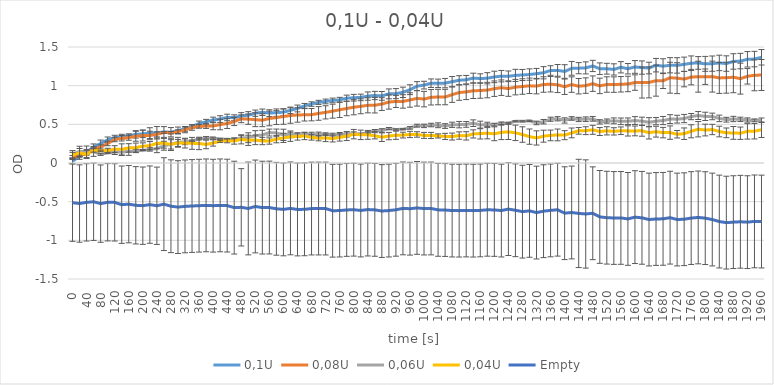
| Category | 0,1U | 0,08U | 0,06U | 0,04U | Empty |
|---|---|---|---|---|---|
| 0.0 | 0.023 | 0.071 | 0.111 | 0.102 | -0.513 |
| 20.0 | 0.086 | 0.095 | 0.151 | 0.131 | -0.524 |
| 40.0 | 0.138 | 0.133 | 0.145 | 0.111 | -0.509 |
| 60.0 | 0.208 | 0.178 | 0.147 | 0.163 | -0.501 |
| 80.0 | 0.252 | 0.208 | 0.112 | 0.159 | -0.525 |
| 100.0 | 0.3 | 0.253 | 0.132 | 0.162 | -0.508 |
| 120.0 | 0.328 | 0.304 | 0.142 | 0.18 | -0.509 |
| 140.0 | 0.34 | 0.32 | 0.14 | 0.176 | -0.539 |
| 160.0 | 0.353 | 0.327 | 0.15 | 0.195 | -0.532 |
| 180.0 | 0.37 | 0.346 | 0.156 | 0.199 | -0.547 |
| 200.0 | 0.377 | 0.355 | 0.163 | 0.217 | -0.552 |
| 220.0 | 0.386 | 0.356 | 0.176 | 0.225 | -0.538 |
| 240.0 | 0.391 | 0.37 | 0.187 | 0.254 | -0.553 |
| 260.0 | 0.401 | 0.395 | 0.223 | 0.255 | -0.532 |
| 280.0 | 0.398 | 0.391 | 0.241 | 0.241 | -0.559 |
| 300.0 | 0.42 | 0.405 | 0.268 | 0.259 | -0.57 |
| 320.0 | 0.441 | 0.428 | 0.274 | 0.257 | -0.561 |
| 340.0 | 0.472 | 0.458 | 0.287 | 0.254 | -0.556 |
| 360.0 | 0.509 | 0.474 | 0.31 | 0.253 | -0.552 |
| 380.0 | 0.532 | 0.478 | 0.325 | 0.24 | -0.548 |
| 400.0 | 0.557 | 0.479 | 0.322 | 0.259 | -0.552 |
| 420.0 | 0.568 | 0.497 | 0.31 | 0.28 | -0.548 |
| 440.0 | 0.589 | 0.51 | 0.307 | 0.287 | -0.551 |
| 460.0 | 0.587 | 0.536 | 0.302 | 0.285 | -0.577 |
| 480.0 | 0.606 | 0.572 | 0.323 | 0.306 | -0.573 |
| 500.0 | 0.617 | 0.567 | 0.327 | 0.293 | -0.588 |
| 520.0 | 0.644 | 0.56 | 0.352 | 0.299 | -0.562 |
| 540.0 | 0.656 | 0.553 | 0.362 | 0.284 | -0.577 |
| 560.0 | 0.645 | 0.576 | 0.394 | 0.284 | -0.576 |
| 580.0 | 0.651 | 0.587 | 0.389 | 0.308 | -0.592 |
| 600.0 | 0.657 | 0.601 | 0.364 | 0.325 | -0.6 |
| 620.0 | 0.681 | 0.614 | 0.371 | 0.339 | -0.587 |
| 640.0 | 0.705 | 0.621 | 0.36 | 0.343 | -0.601 |
| 660.0 | 0.739 | 0.623 | 0.368 | 0.35 | -0.599 |
| 680.0 | 0.762 | 0.625 | 0.371 | 0.331 | -0.589 |
| 700.0 | 0.784 | 0.641 | 0.374 | 0.32 | -0.589 |
| 720.0 | 0.796 | 0.655 | 0.372 | 0.324 | -0.589 |
| 740.0 | 0.809 | 0.67 | 0.36 | 0.316 | -0.617 |
| 760.0 | 0.817 | 0.688 | 0.366 | 0.33 | -0.615 |
| 780.0 | 0.838 | 0.705 | 0.368 | 0.348 | -0.607 |
| 800.0 | 0.844 | 0.721 | 0.379 | 0.373 | -0.604 |
| 820.0 | 0.848 | 0.733 | 0.372 | 0.364 | -0.614 |
| 840.0 | 0.865 | 0.746 | 0.394 | 0.364 | -0.602 |
| 860.0 | 0.873 | 0.747 | 0.419 | 0.352 | -0.606 |
| 880.0 | 0.868 | 0.762 | 0.42 | 0.334 | -0.621 |
| 900.0 | 0.894 | 0.788 | 0.445 | 0.348 | -0.615 |
| 920.0 | 0.897 | 0.796 | 0.433 | 0.359 | -0.605 |
| 940.0 | 0.914 | 0.796 | 0.437 | 0.361 | -0.587 |
| 960.0 | 0.948 | 0.815 | 0.454 | 0.369 | -0.591 |
| 980.0 | 0.994 | 0.836 | 0.483 | 0.369 | -0.581 |
| 1000.0 | 1.007 | 0.826 | 0.48 | 0.357 | -0.589 |
| 1020.0 | 1.032 | 0.85 | 0.491 | 0.356 | -0.588 |
| 1040.0 | 1.03 | 0.853 | 0.488 | 0.35 | -0.606 |
| 1060.0 | 1.033 | 0.853 | 0.478 | 0.344 | -0.608 |
| 1080.0 | 1.052 | 0.884 | 0.494 | 0.342 | -0.615 |
| 1100.0 | 1.07 | 0.911 | 0.496 | 0.355 | -0.616 |
| 1120.0 | 1.076 | 0.92 | 0.499 | 0.351 | -0.614 |
| 1140.0 | 1.098 | 0.934 | 0.515 | 0.376 | -0.616 |
| 1160.0 | 1.092 | 0.937 | 0.492 | 0.381 | -0.613 |
| 1180.0 | 1.096 | 0.943 | 0.499 | 0.385 | -0.605 |
| 1200.0 | 1.113 | 0.961 | 0.496 | 0.378 | -0.607 |
| 1220.0 | 1.123 | 0.974 | 0.514 | 0.396 | -0.615 |
| 1240.0 | 1.121 | 0.962 | 0.515 | 0.403 | -0.596 |
| 1260.0 | 1.133 | 0.981 | 0.54 | 0.39 | -0.611 |
| 1280.0 | 1.138 | 0.989 | 0.539 | 0.368 | -0.629 |
| 1300.0 | 1.144 | 0.998 | 0.545 | 0.341 | -0.619 |
| 1320.0 | 1.155 | 0.994 | 0.518 | 0.324 | -0.641 |
| 1340.0 | 1.167 | 1.015 | 0.534 | 0.347 | -0.623 |
| 1360.0 | 1.196 | 1.019 | 0.566 | 0.357 | -0.613 |
| 1380.0 | 1.198 | 1.011 | 0.572 | 0.363 | -0.604 |
| 1400.0 | 1.183 | 0.986 | 0.55 | 0.36 | -0.649 |
| 1420.0 | 1.224 | 1.014 | 0.576 | 0.389 | -0.64 |
| 1440.0 | 1.226 | 0.993 | 0.563 | 0.416 | -0.652 |
| 1460.0 | 1.23 | 1.001 | 0.566 | 0.418 | -0.659 |
| 1480.0 | 1.255 | 1.026 | 0.571 | 0.429 | -0.65 |
| 1500.0 | 1.219 | 0.997 | 0.532 | 0.407 | -0.697 |
| 1520.0 | 1.219 | 1.015 | 0.542 | 0.416 | -0.707 |
| 1540.0 | 1.21 | 1.014 | 0.545 | 0.409 | -0.711 |
| 1560.0 | 1.238 | 1.018 | 0.539 | 0.417 | -0.71 |
| 1580.0 | 1.219 | 1.022 | 0.54 | 0.415 | -0.723 |
| 1600.0 | 1.242 | 1.04 | 0.549 | 0.415 | -0.7 |
| 1620.0 | 1.234 | 1.04 | 0.541 | 0.416 | -0.709 |
| 1640.0 | 1.228 | 1.042 | 0.527 | 0.392 | -0.731 |
| 1660.0 | 1.265 | 1.064 | 0.541 | 0.405 | -0.724 |
| 1680.0 | 1.252 | 1.063 | 0.549 | 0.393 | -0.722 |
| 1700.0 | 1.264 | 1.103 | 0.568 | 0.393 | -0.707 |
| 1720.0 | 1.262 | 1.097 | 0.567 | 0.372 | -0.731 |
| 1740.0 | 1.276 | 1.085 | 0.575 | 0.379 | -0.727 |
| 1760.0 | 1.29 | 1.111 | 0.6 | 0.41 | -0.712 |
| 1780.0 | 1.294 | 1.116 | 0.614 | 0.437 | -0.704 |
| 1800.0 | 1.282 | 1.116 | 0.603 | 0.426 | -0.713 |
| 1820.0 | 1.285 | 1.117 | 0.602 | 0.433 | -0.731 |
| 1840.0 | 1.294 | 1.1 | 0.577 | 0.407 | -0.757 |
| 1860.0 | 1.286 | 1.103 | 0.56 | 0.39 | -0.771 |
| 1880.0 | 1.313 | 1.109 | 0.569 | 0.389 | -0.765 |
| 1900.0 | 1.318 | 1.091 | 0.564 | 0.385 | -0.76 |
| 1920.0 | 1.341 | 1.121 | 0.556 | 0.409 | -0.765 |
| 1940.0 | 1.344 | 1.134 | 0.551 | 0.411 | -0.755 |
| 1960.0 | 1.367 | 1.138 | 0.553 | 0.43 | -0.757 |